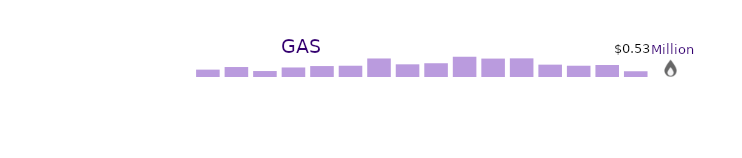
| Category | Gas |
|---|---|
| 1996 | 0 |
| 1997 | 0 |
| 1998 | 0 |
| 1999 | 0 |
| 2000 | 0 |
| 2001 | 0.68 |
| 2002 | 0.92 |
| 2003 | 0.55 |
| 2004 | 0.88 |
| 2005 | 1.01 |
| 2006 | 1.04 |
| 2007 | 1.71 |
| 2008 | 1.17 |
| 2009 | 1.27 |
| 2010 | 1.87 |
| 2011 | 1.7 |
| 2012 | 1.72 |
| 2013 | 1.14 |
| 2014 | 1.04 |
| 2015 | 1.11 |
| 2016 | 0.53 |